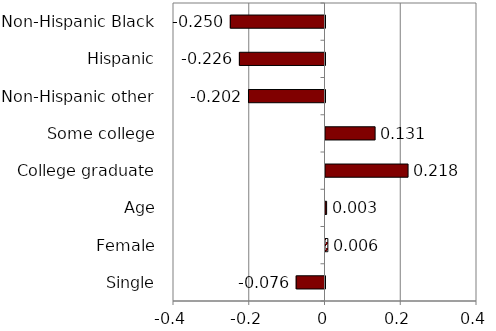
| Category | Series 0 |
|---|---|
| Single | -0.076 |
| Female | 0.006 |
| Age | 0.003 |
| College graduate | 0.218 |
| Some college | 0.131 |
| Non-Hispanic other | -0.202 |
| Hispanic | -0.226 |
| Non-Hispanic Black | -0.25 |